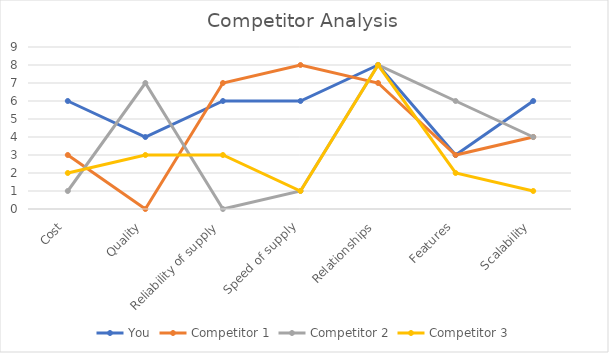
| Category | You | Competitor 1 | Competitor 2 | Competitor 3 |
|---|---|---|---|---|
| Cost | 6 | 3 | 1 | 2 |
| Quality | 4 | 0 | 7 | 3 |
| Reliability of supply | 6 | 7 | 0 | 3 |
| Speed of supply | 6 | 8 | 1 | 1 |
| Relationships | 8 | 7 | 8 | 8 |
| Features | 3 | 3 | 6 | 2 |
| Scalability | 6 | 4 | 4 | 1 |